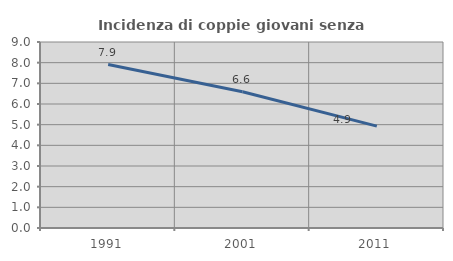
| Category | Incidenza di coppie giovani senza figli |
|---|---|
| 1991.0 | 7.907 |
| 2001.0 | 6.594 |
| 2011.0 | 4.927 |